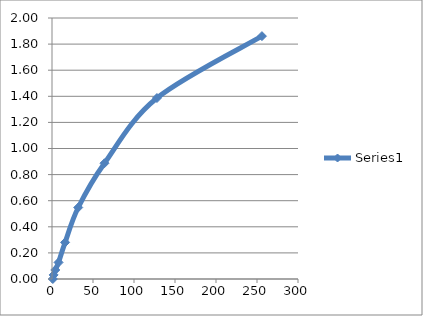
| Category | Series 0 |
|---|---|
| 1.0 | 0 |
| 2.0 | 0.031 |
| 4.0 | 0.069 |
| 8.0 | 0.127 |
| 16.0 | 0.281 |
| 32.0 | 0.548 |
| 64.0 | 0.887 |
| 128.0 | 1.387 |
| 256.0 | 1.861 |